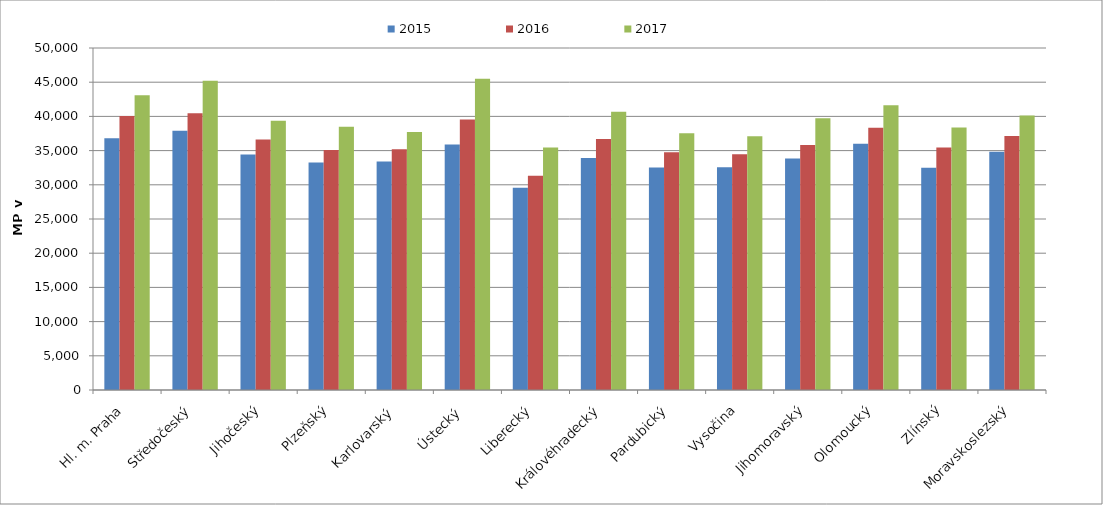
| Category | 2015 | 2016 | 2017 |
|---|---|---|---|
| Hl. m. Praha | 36803.856 | 40054.702 | 43099.932 |
| Středočeský | 37910.066 | 40464.232 | 45224.004 |
| Jihočeský | 34447.073 | 36611.544 | 39346.264 |
| Plzeňský | 33249.645 | 35091.745 | 38484.403 |
| Karlovarský  | 33420.278 | 35203.609 | 37713.503 |
| Ústecký   | 35900.8 | 39564.345 | 45511.378 |
| Liberecký | 29557.806 | 31338.792 | 35443.653 |
| Královéhradecký | 33901.026 | 36713.785 | 40686.605 |
| Pardubický | 32538.847 | 34759.816 | 37528.029 |
| Vysočina | 32566.323 | 34482.858 | 37091.629 |
| Jihomoravský | 33832.239 | 35825.934 | 39729.348 |
| Olomoucký | 36019.193 | 38333.971 | 41646.211 |
| Zlínský | 32509.843 | 35453.002 | 38381.664 |
| Moravskoslezský | 34830.164 | 37130.413 | 40129.756 |